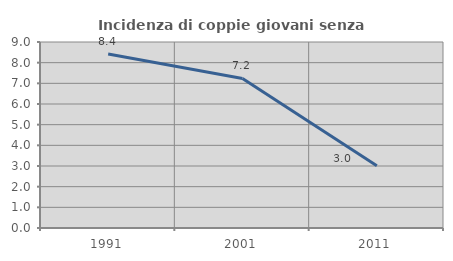
| Category | Incidenza di coppie giovani senza figli |
|---|---|
| 1991.0 | 8.422 |
| 2001.0 | 7.235 |
| 2011.0 | 3.015 |